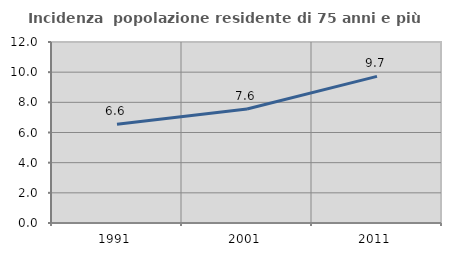
| Category | Incidenza  popolazione residente di 75 anni e più |
|---|---|
| 1991.0 | 6.55 |
| 2001.0 | 7.558 |
| 2011.0 | 9.72 |